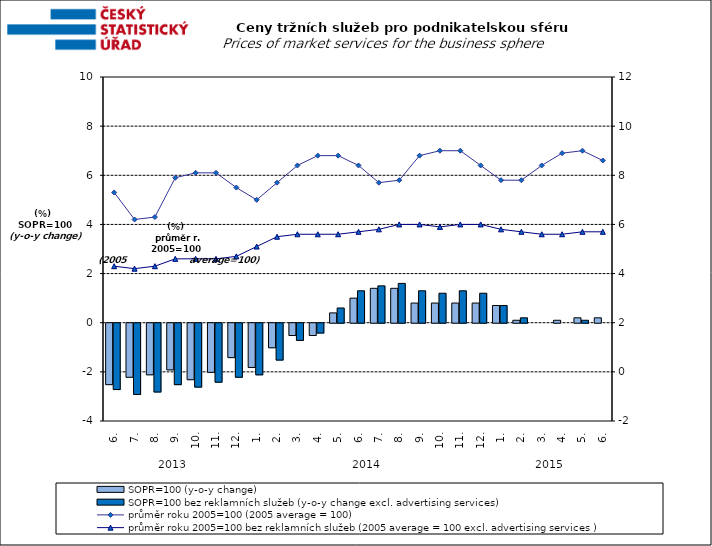
| Category | SOPR=100 (y-o-y change)   | SOPR=100 bez reklamních služeb (y-o-y change excl. advertising services)   |
|---|---|---|
| 0 | -2.5 | -2.7 |
| 1 | -2.2 | -2.9 |
| 2 | -2.1 | -2.8 |
| 3 | -1.9 | -2.5 |
| 4 | -2.3 | -2.6 |
| 5 | -2 | -2.4 |
| 6 | -1.4 | -2.2 |
| 7 | -1.8 | -2.1 |
| 8 | -1 | -1.5 |
| 9 | -0.5 | -0.7 |
| 10 | -0.5 | -0.4 |
| 11 | 0.4 | 0.6 |
| 12 | 1 | 1.3 |
| 13 | 1.4 | 1.5 |
| 14 | 1.4 | 1.6 |
| 15 | 0.8 | 1.3 |
| 16 | 0.8 | 1.2 |
| 17 | 0.8 | 1.3 |
| 18 | 0.8 | 1.2 |
| 19 | 0.7 | 0.7 |
| 20 | 0.1 | 0.2 |
| 21 | 0 | 0 |
| 22 | 0.1 | 0 |
| 23 | 0.2 | 0.1 |
| 24 | 0.2 | 0 |